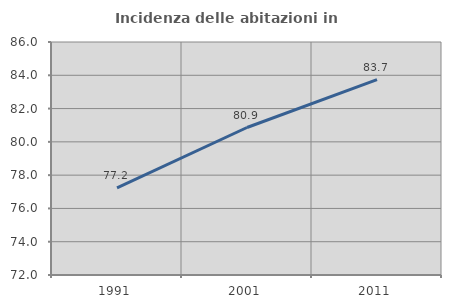
| Category | Incidenza delle abitazioni in proprietà  |
|---|---|
| 1991.0 | 77.239 |
| 2001.0 | 80.862 |
| 2011.0 | 83.742 |